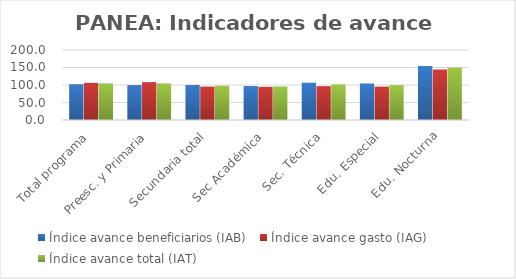
| Category | Índice avance beneficiarios (IAB)  | Índice avance gasto (IAG) | Índice avance total (IAT)  |
|---|---|---|---|
| Total programa | 102.277 | 106.094 | 104.185 |
| Preesc. y Primaria | 99.794 | 108.211 | 104.003 |
| Secundaria total | 100.119 | 95.321 | 97.72 |
| Sec Académica | 96.971 | 94.632 | 95.802 |
| Sec. Técnica | 106.451 | 96.724 | 101.587 |
| Edu. Especial | 104.141 | 95.211 | 99.676 |
| Edu. Nocturna | 154.145 | 144.353 | 149.249 |